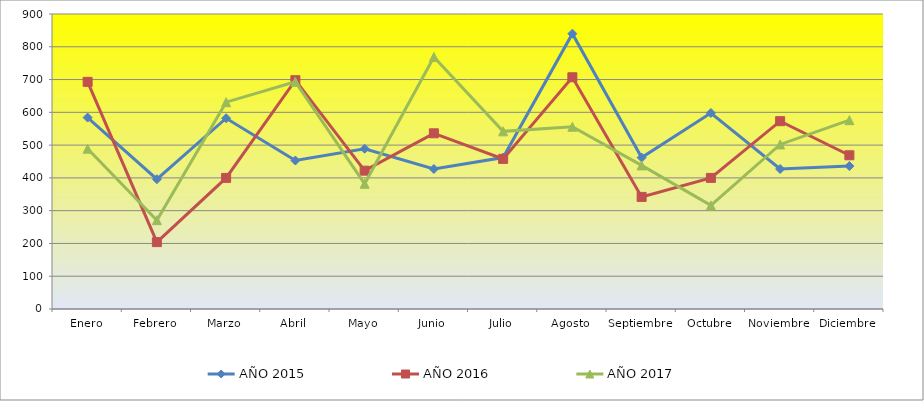
| Category | AÑO 2015 | AÑO 2016 | AÑO 2017 |
|---|---|---|---|
| Enero | 584 | 693 | 489 |
| Febrero | 396 | 204 | 271 |
| Marzo | 582 | 400 | 631 |
| Abril | 453 | 698 | 693 |
| Mayo | 489 | 422 | 382 |
| Junio | 427 | 536 | 769 |
| Julio | 462 | 458 | 542 |
| Agosto | 840 | 707 | 556 |
| Septiembre | 462 | 342 | 438 |
| Octubre | 598 | 400 | 316 |
| Noviembre | 427 | 573 | 502 |
| Diciembre | 436 | 469 | 576 |